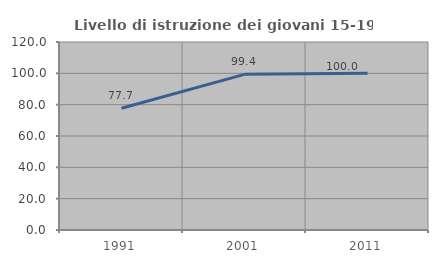
| Category | Livello di istruzione dei giovani 15-19 anni |
|---|---|
| 1991.0 | 77.744 |
| 2001.0 | 99.367 |
| 2011.0 | 100 |